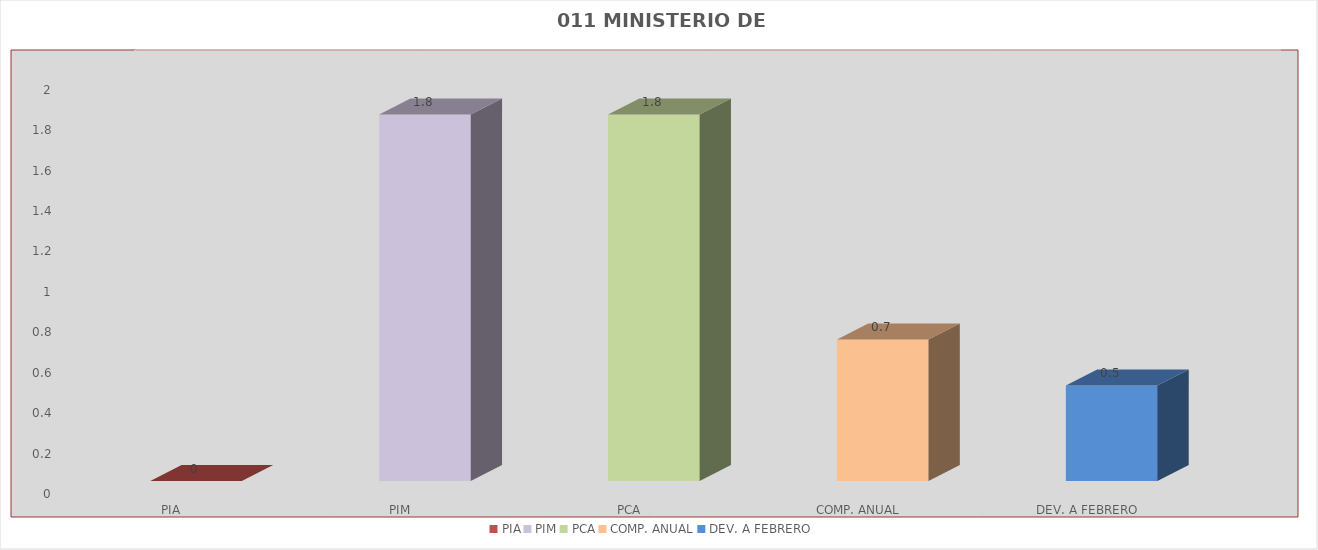
| Category | 011 MINISTERIO DE SALUD |
|---|---|
| PIA | 0 |
| PIM | 1.813 |
| PCA | 1.813 |
| COMP. ANUAL | 0.7 |
| DEV. A FEBRERO | 0.472 |